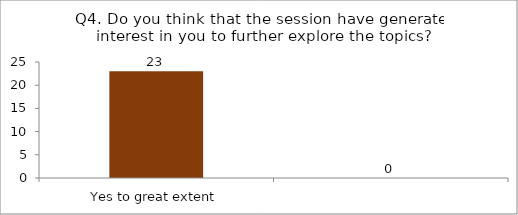
| Category | Q4. Do you think that the session have generated interest in you to further explore the topics? |
|---|---|
| Yes to great extent | 23 |
|  | 0 |